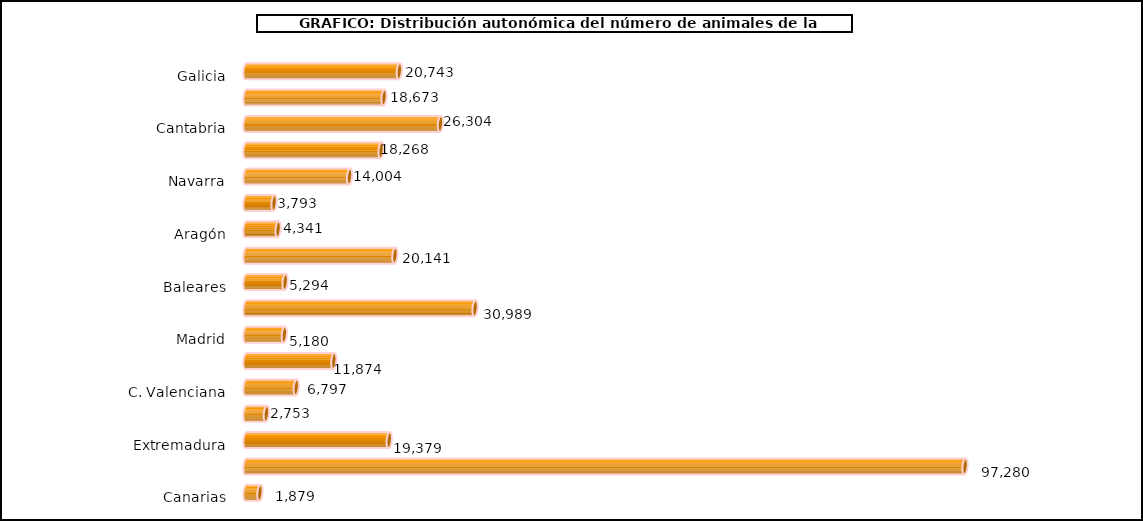
| Category | num. Animales |
|---|---|
|   Galicia | 20743 |
|   P. de Asturias | 18673 |
|   Cantabria | 26304 |
|   País Vasco | 18268 |
|   Navarra | 14004 |
|   La Rioja | 3793 |
|   Aragón | 4341 |
|   Cataluña | 20141 |
|   Baleares | 5294 |
|   Castilla y León | 30989 |
|   Madrid | 5180 |
|   Castilla – La Mancha | 11874 |
|   C. Valenciana | 6797 |
|   R. de Murcia | 2753 |
|   Extremadura | 19379 |
|   Andalucía | 97280 |
|   Canarias | 1879 |